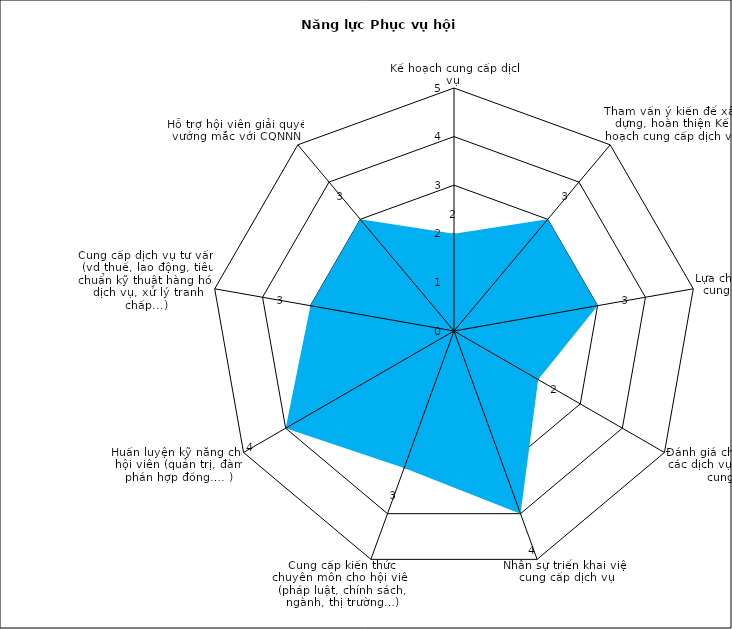
| Category | Series 0 |
|---|---|
| Kế hoạch cung cấp dịch vụ  | 2 |
| Tham vấn ý kiến để xây dựng, hoàn thiện Kế hoạch cung cấp dịch vụ | 3 |
| Lựa chọn dịch vụ (cụ thể) cung cấp cho hội viên  | 3 |
| Đánh giá chất lượng của các dịch vụ mà hiệp hội cung cấp | 2 |
| Nhân sự triển khai việc cung cấp dịch vụ | 4 |
| Cung cấp kiến thức chuyên môn cho hội viên (pháp luật, chính sách, ngành, thị trường…) | 3 |
| Huấn luyện kỹ năng cho hội viên (quản trị, đàm phán hợp đồng…. ) | 4 |
| Cung cấp dịch vụ tư vấn  (vd thuế, lao động, tiêu chuẩn kỹ thuật hàng hóa dịch vụ, xử lý tranh chấp...) | 3 |
| Hỗ trợ hội viên giải quyết vướng mắc với CQNNN  | 3 |